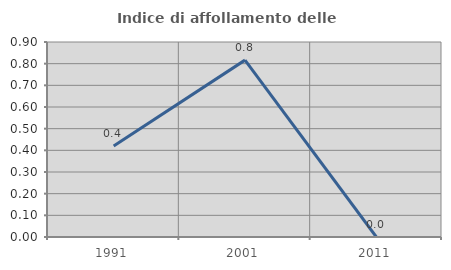
| Category | Indice di affollamento delle abitazioni  |
|---|---|
| 1991.0 | 0.42 |
| 2001.0 | 0.816 |
| 2011.0 | 0 |